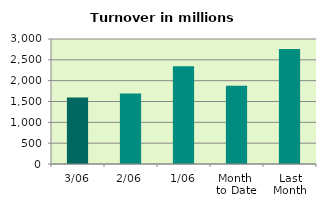
| Category | Series 0 |
|---|---|
| 3/06 | 1593.06 |
| 2/06 | 1689.175 |
| 1/06 | 2348.119 |
| Month 
to Date | 1876.785 |
| Last
Month | 2758.944 |